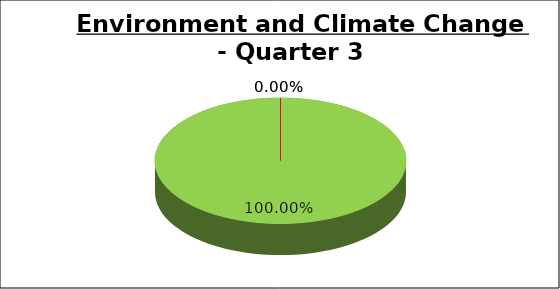
| Category | Q3 |
|---|---|
| Green | 1 |
| Amber | 0 |
| Red | 0 |